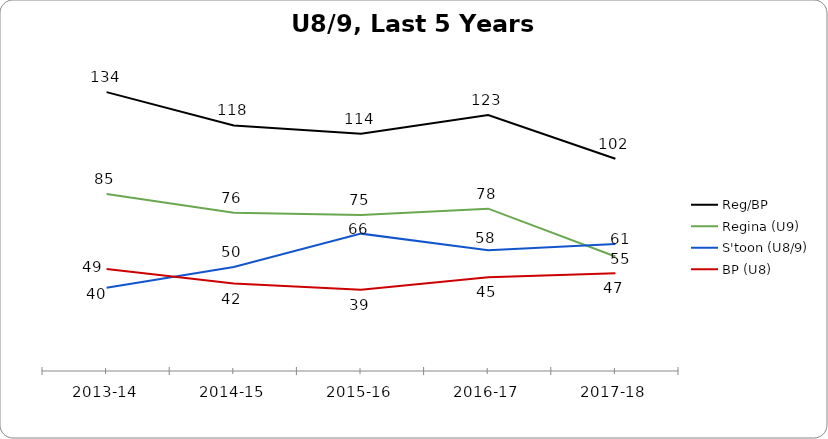
| Category | Reg/BP | Regina (U9) | S'toon (U8/9) | BP (U8) |
|---|---|---|---|---|
| 2013-14 | 134 | 85 | 40 | 49 |
| 2014-15 | 118 | 76 | 50 | 42 |
| 2015-16 | 114 | 75 | 66 | 39 |
| 2016-17 | 123 | 78 | 58 | 45 |
| 2017-18 | 102 | 55 | 61 | 47 |